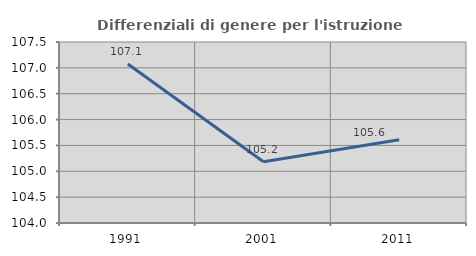
| Category | Differenziali di genere per l'istruzione superiore |
|---|---|
| 1991.0 | 107.074 |
| 2001.0 | 105.186 |
| 2011.0 | 105.609 |